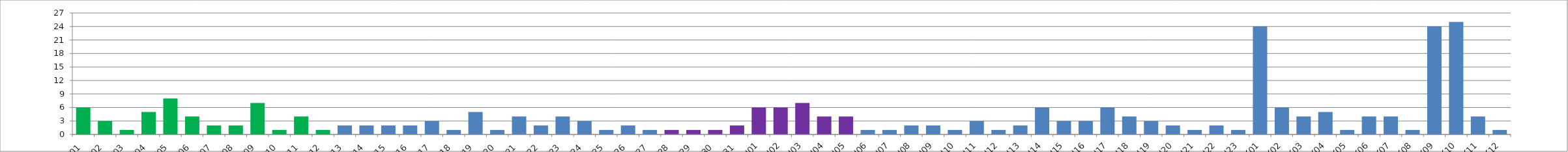
| Category | Series 0 |
|---|---|
| W01 | 6 |
| W02 | 3 |
| W03 | 1 |
| W04 | 5 |
| W05 | 8 |
| W06 | 4 |
| W07 | 2 |
| W08 | 2 |
| W09 | 7 |
| W10 | 1 |
| W11 | 4 |
| W12 | 1 |
| W13 | 2 |
| W14 | 2 |
| W15 | 2 |
| W16 | 2 |
| W17 | 3 |
| W18 | 1 |
| W19 | 5 |
| W20 | 1 |
| W21 | 4 |
| W22 | 2 |
| W23 | 4 |
| W24 | 3 |
| W25 | 1 |
| W26 | 2 |
| W27 | 1 |
| W28 | 1 |
| W29 | 1 |
| W30 | 1 |
| W31 | 2 |
| U01 | 6 |
| U02 | 6 |
| U03 | 7 |
| U04 | 4 |
| U05 | 4 |
| U06 | 1 |
| U07 | 1 |
| U08 | 2 |
| U09 | 2 |
| U10 | 1 |
| U11 | 3 |
| U12 | 1 |
| U13 | 2 |
| U14 | 6 |
| U15 | 3 |
| U16 | 3 |
| U17 | 6 |
| U18 | 4 |
| U19 | 3 |
| U20 | 2 |
| U21 | 1 |
| U22 | 2 |
| U23 | 1 |
| K01 | 24 |
| K02 | 6 |
| K03 | 4 |
| K04 | 5 |
| K05 | 1 |
| K06 | 4 |
| K07 | 4 |
| K08 | 1 |
| K09 | 24 |
| K10 | 25 |
| K11 | 4 |
| K12 | 1 |